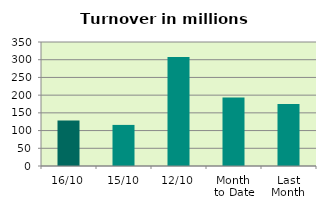
| Category | Series 0 |
|---|---|
| 16/10 | 128.186 |
| 15/10 | 115.988 |
| 12/10 | 307.54 |
| Month 
to Date | 193.697 |
| Last
Month | 174.723 |